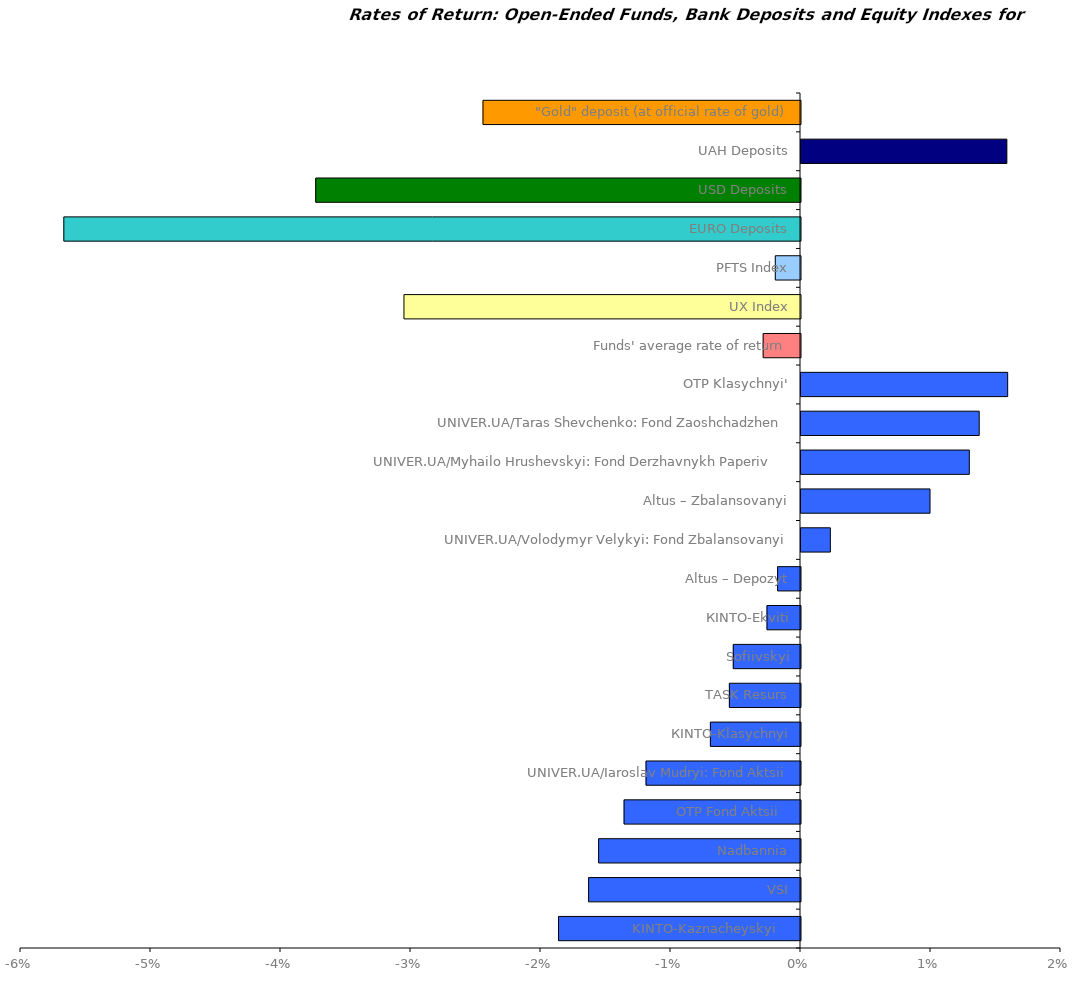
| Category | Series 0 |
|---|---|
| KINTO-Kaznacheyskyi    | -0.019 |
| VSI | -0.016 |
| Nadbannia | -0.016 |
| OTP Fond Aktsii   | -0.014 |
| UNIVER.UA/Iaroslav Mudryi: Fond Aktsii | -0.012 |
| КІNТО-Klasychnyi | -0.007 |
| ТАSK Resurs | -0.005 |
| Sofiivskyi | -0.005 |
| КІNТО-Еkviti | -0.003 |
| Altus – Depozyt | -0.002 |
| UNIVER.UA/Volodymyr Velykyi: Fond Zbalansovanyi | 0.002 |
| Altus – Zbalansovanyi | 0.01 |
| UNIVER.UA/Myhailo Hrushevskyi: Fond Derzhavnykh Paperiv    | 0.013 |
| UNIVER.UA/Taras Shevchenko: Fond Zaoshchadzhen | 0.014 |
| OTP Klasychnyi' | 0.016 |
| Funds' average rate of return | -0.003 |
| UX Index | -0.031 |
| PFTS Index | -0.002 |
| EURO Deposits | -0.057 |
| USD Deposits | -0.037 |
| UAH Deposits | 0.016 |
| "Gold" deposit (at official rate of gold) | -0.024 |